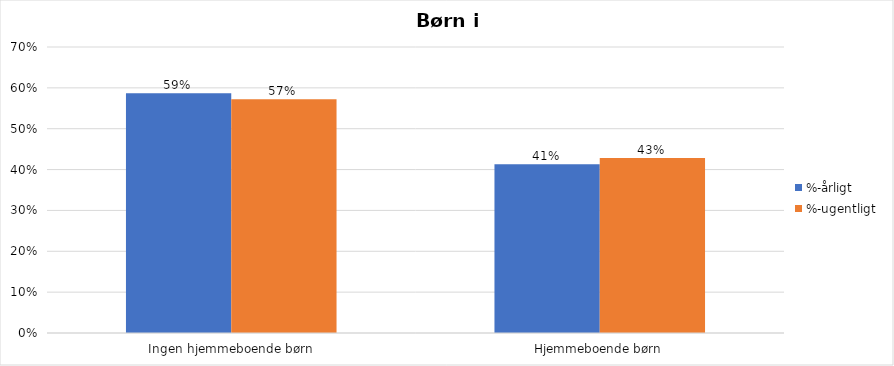
| Category | %-årligt | %-ugentligt |
|---|---|---|
| Ingen hjemmeboende børn | 0.587 | 0.572 |
| Hjemmeboende børn | 0.413 | 0.428 |